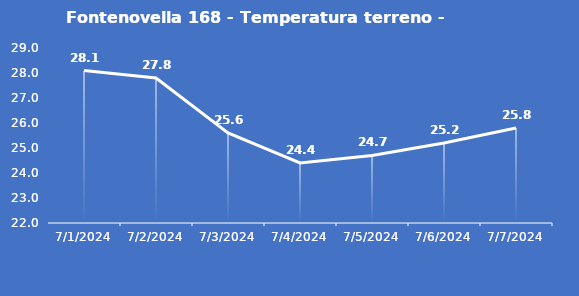
| Category | Fontenovella 168 - Temperatura terreno - Grezzo (°C) |
|---|---|
| 7/1/24 | 28.1 |
| 7/2/24 | 27.8 |
| 7/3/24 | 25.6 |
| 7/4/24 | 24.4 |
| 7/5/24 | 24.7 |
| 7/6/24 | 25.2 |
| 7/7/24 | 25.8 |